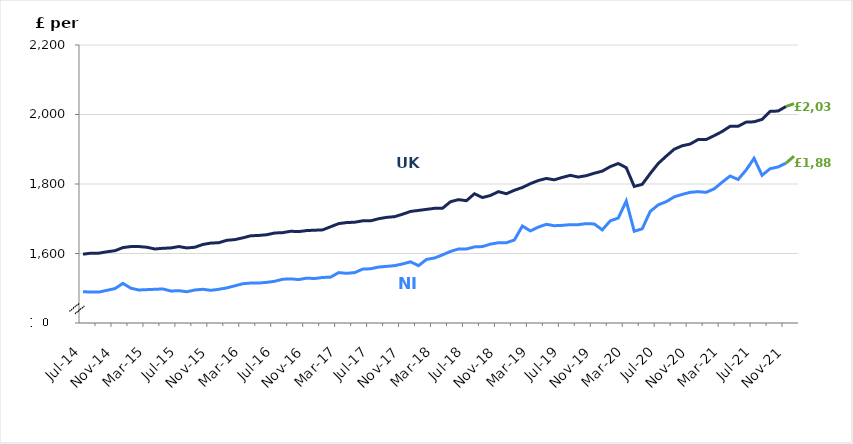
| Category | Series 0 | Series 1 |
|---|---|---|
| 2014-07-01 | 1490 | 1598 |
| 2014-08-01 | 1489 | 1601 |
| 2014-09-01 | 1489 | 1601 |
| 2014-10-01 | 1494 | 1605 |
| 2014-11-01 | 1499 | 1608 |
| 2014-12-01 | 1514 | 1617 |
| 2015-01-01 | 1500 | 1620 |
| 2015-02-01 | 1495 | 1620 |
| 2015-03-01 | 1496 | 1618 |
| 2015-04-01 | 1497 | 1613 |
| 2015-05-01 | 1498 | 1615 |
| 2015-06-01 | 1492 | 1616 |
| 2015-07-01 | 1493 | 1620 |
| 2015-08-01 | 1490 | 1616 |
| 2015-09-01 | 1495 | 1618 |
| 2015-10-01 | 1497 | 1626 |
| 2015-11-01 | 1494 | 1630 |
| 2015-12-01 | 1497 | 1631 |
| 2016-01-01 | 1501 | 1638 |
| 2016-02-01 | 1507 | 1640 |
| 2016-03-01 | 1513 | 1645 |
| 2016-04-01 | 1515 | 1651 |
| 2016-05-01 | 1515 | 1652 |
| 2016-06-01 | 1517 | 1654 |
| 2016-07-01 | 1520 | 1659 |
| 2016-08-01 | 1526 | 1660 |
| 2016-09-01 | 1527 | 1664 |
| 2016-10-01 | 1525 | 1663 |
| 2016-11-01 | 1529 | 1666 |
| 2016-12-01 | 1528 | 1667 |
| 2017-01-01 | 1531 | 1668 |
| 2017-02-01 | 1532 | 1677 |
| 2017-03-01 | 1545 | 1686 |
| 2017-04-01 | 1543 | 1689 |
| 2017-05-01 | 1545 | 1690 |
| 2017-06-01 | 1555 | 1694 |
| 2017-07-01 | 1556 | 1694 |
| 2017-08-01 | 1561 | 1700 |
| 2017-09-01 | 1563 | 1704 |
| 2017-10-01 | 1565 | 1706 |
| 2017-11-01 | 1570 | 1713 |
| 2017-12-01 | 1576 | 1721 |
| 2018-01-01 | 1565 | 1724 |
| 2018-02-01 | 1583 | 1727 |
| 2018-03-01 | 1587 | 1730 |
| 2018-04-01 | 1596 | 1730 |
| 2018-05-01 | 1606 | 1749 |
| 2018-06-01 | 1613 | 1755 |
| 2018-07-01 | 1613 | 1752 |
| 2018-08-01 | 1619 | 1772 |
| 2018-09-01 | 1620 | 1761 |
| 2018-10-01 | 1627 | 1767 |
| 2018-11-01 | 1631 | 1778 |
| 2018-12-01 | 1631 | 1772 |
| 2019-01-01 | 1639 | 1782 |
| 2019-02-01 | 1679 | 1790 |
| 2019-03-01 | 1665 | 1801 |
| 2019-04-01 | 1676 | 1810 |
| 2019-05-01 | 1684 | 1816 |
| 2019-06-01 | 1680 | 1812 |
| 2019-07-01 | 1681 | 1819 |
| 2019-08-01 | 1683 | 1825 |
| 2019-09-01 | 1683 | 1820 |
| 2019-10-01 | 1686 | 1824 |
| 2019-11-01 | 1685 | 1831 |
| 2019-12-01 | 1668 | 1837 |
| 2020-01-01 | 1694 | 1850 |
| 2020-02-01 | 1702 | 1859 |
| 2020-03-01 | 1751 | 1847 |
| 2020-04-01 | 1664 | 1793 |
| 2020-05-01 | 1671 | 1799 |
| 2020-06-01 | 1721 | 1830 |
| 2020-07-01 | 1740 | 1859 |
| 2020-08-01 | 1749 | 1880 |
| 2020-09-01 | 1763 | 1900 |
| 2020-10-01 | 1770 | 1910 |
| 2020-11-01 | 1776 | 1915 |
| 2020-12-01 | 1778 | 1928 |
| 2021-01-01 | 1776 | 1928 |
| 2021-02-01 | 1786 | 1939 |
| 2021-03-01 | 1805 | 1951 |
| 2021-04-01 | 1823 | 1966 |
| 2021-05-01 | 1813 | 1966 |
| 2021-06-01 | 1840 | 1978 |
| 2021-07-01 | 1874 | 1979 |
| 2021-08-01 | 1825 | 1986 |
| 2021-09-01 | 1844 | 2009 |
| 2021-10-01 | 1849 | 2010 |
| 2021-11-01 | 1860 | 2023 |
| 2021-12-01 | 1880 | 2031 |